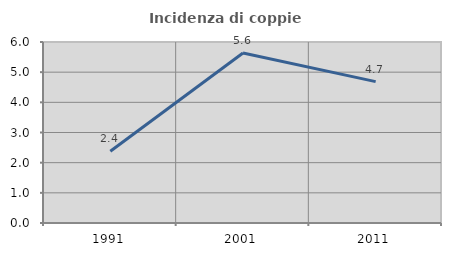
| Category | Incidenza di coppie miste |
|---|---|
| 1991.0 | 2.381 |
| 2001.0 | 5.634 |
| 2011.0 | 4.688 |